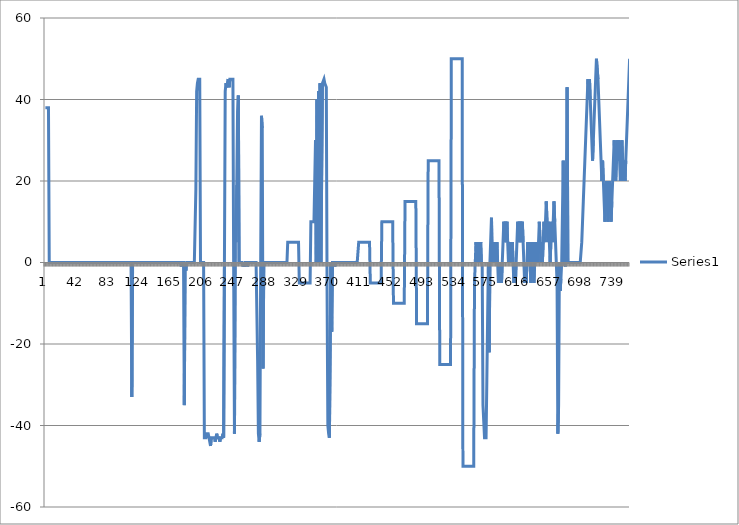
| Category | Series 0 |
|---|---|
| 0 | 38 |
| 1 | 38 |
| 2 | 38 |
| 3 | 38 |
| 4 | 38 |
| 5 | 0 |
| 6 | 0 |
| 7 | 0 |
| 8 | 0 |
| 9 | 0 |
| 10 | 0 |
| 11 | 0 |
| 12 | 0 |
| 13 | 0 |
| 14 | 0 |
| 15 | 0 |
| 16 | 0 |
| 17 | 0 |
| 18 | 0 |
| 19 | 0 |
| 20 | 0 |
| 21 | 0 |
| 22 | 0 |
| 23 | 0 |
| 24 | 0 |
| 25 | 0 |
| 26 | 0 |
| 27 | 0 |
| 28 | 0 |
| 29 | 0 |
| 30 | 0 |
| 31 | 0 |
| 32 | 0 |
| 33 | 0 |
| 34 | 0 |
| 35 | 0 |
| 36 | 0 |
| 37 | 0 |
| 38 | 0 |
| 39 | 0 |
| 40 | 0 |
| 41 | 0 |
| 42 | 0 |
| 43 | 0 |
| 44 | 0 |
| 45 | 0 |
| 46 | 0 |
| 47 | 0 |
| 48 | 0 |
| 49 | 0 |
| 50 | 0 |
| 51 | 0 |
| 52 | 0 |
| 53 | 0 |
| 54 | 0 |
| 55 | 0 |
| 56 | 0 |
| 57 | 0 |
| 58 | 0 |
| 59 | 0 |
| 60 | 0 |
| 61 | 0 |
| 62 | 0 |
| 63 | 0 |
| 64 | 0 |
| 65 | 0 |
| 66 | 0 |
| 67 | 0 |
| 68 | 0 |
| 69 | 0 |
| 70 | 0 |
| 71 | 0 |
| 72 | 0 |
| 73 | 0 |
| 74 | 0 |
| 75 | 0 |
| 76 | 0 |
| 77 | 0 |
| 78 | 0 |
| 79 | 0 |
| 80 | 0 |
| 81 | 0 |
| 82 | 0 |
| 83 | 0 |
| 84 | 0 |
| 85 | 0 |
| 86 | 0 |
| 87 | 0 |
| 88 | 0 |
| 89 | 0 |
| 90 | 0 |
| 91 | 0 |
| 92 | 0 |
| 93 | 0 |
| 94 | 0 |
| 95 | 0 |
| 96 | 0 |
| 97 | 0 |
| 98 | 0 |
| 99 | 0 |
| 100 | 0 |
| 101 | 0 |
| 102 | 0 |
| 103 | 0 |
| 104 | 0 |
| 105 | 0 |
| 106 | 0 |
| 107 | 0 |
| 108 | 0 |
| 109 | 0 |
| 110 | 0 |
| 111 | 0 |
| 112 | -33 |
| 113 | 0 |
| 114 | 0 |
| 115 | 0 |
| 116 | 0 |
| 117 | 0 |
| 118 | 0 |
| 119 | 0 |
| 120 | 0 |
| 121 | 0 |
| 122 | 0 |
| 123 | 0 |
| 124 | 0 |
| 125 | 0 |
| 126 | 0 |
| 127 | 0 |
| 128 | 0 |
| 129 | 0 |
| 130 | 0 |
| 131 | 0 |
| 132 | 0 |
| 133 | 0 |
| 134 | 0 |
| 135 | 0 |
| 136 | 0 |
| 137 | 0 |
| 138 | 0 |
| 139 | 0 |
| 140 | 0 |
| 141 | 0 |
| 142 | 0 |
| 143 | 0 |
| 144 | 0 |
| 145 | 0 |
| 146 | 0 |
| 147 | 0 |
| 148 | 0 |
| 149 | 0 |
| 150 | 0 |
| 151 | 0 |
| 152 | 0 |
| 153 | 0 |
| 154 | 0 |
| 155 | 0 |
| 156 | 0 |
| 157 | 0 |
| 158 | 0 |
| 159 | 0 |
| 160 | 0 |
| 161 | 0 |
| 162 | 0 |
| 163 | 0 |
| 164 | 0 |
| 165 | 0 |
| 166 | 0 |
| 167 | 0 |
| 168 | 0 |
| 169 | 0 |
| 170 | 0 |
| 171 | 0 |
| 172 | 0 |
| 173 | 0 |
| 174 | 0 |
| 175 | 0 |
| 176 | -1 |
| 177 | 0 |
| 178 | 0 |
| 179 | 0 |
| 180 | -35 |
| 181 | 0 |
| 182 | -2 |
| 183 | 0 |
| 184 | 0 |
| 185 | 0 |
| 186 | 0 |
| 187 | 0 |
| 188 | 0 |
| 189 | 0 |
| 190 | 0 |
| 191 | 0 |
| 192 | 0 |
| 193 | 0 |
| 194 | 0 |
| 195 | 18 |
| 196 | 42 |
| 197 | 44 |
| 198 | 45 |
| 199 | 45 |
| 200 | 45 |
| 201 | 0 |
| 202 | 0 |
| 203 | 0 |
| 204 | 0 |
| 205 | 0 |
| 206 | -43 |
| 207 | -43 |
| 208 | -43 |
| 209 | -42 |
| 210 | -42 |
| 211 | -42 |
| 212 | -43 |
| 213 | -43 |
| 214 | -45 |
| 215 | -43 |
| 216 | -43 |
| 217 | -43 |
| 218 | -43 |
| 219 | -43 |
| 220 | -44 |
| 221 | -43 |
| 222 | -42 |
| 223 | -43 |
| 224 | -43 |
| 225 | -43 |
| 226 | -44 |
| 227 | -43 |
| 228 | -43 |
| 229 | -43 |
| 230 | -42 |
| 231 | -43 |
| 232 | 0 |
| 233 | 42 |
| 234 | 44 |
| 235 | 43 |
| 236 | 43 |
| 237 | 45 |
| 238 | 43 |
| 239 | 45 |
| 240 | 45 |
| 241 | 45 |
| 242 | 45 |
| 243 | 45 |
| 244 | -3 |
| 245 | -42 |
| 246 | 6 |
| 247 | 5 |
| 248 | 19 |
| 249 | 37 |
| 250 | 41 |
| 251 | 0 |
| 252 | 0 |
| 253 | 0 |
| 254 | 0 |
| 255 | 0 |
| 256 | -1 |
| 257 | 0 |
| 258 | -1 |
| 259 | 0 |
| 260 | 0 |
| 261 | 0 |
| 262 | -1 |
| 263 | 0 |
| 264 | 0 |
| 265 | 0 |
| 266 | 0 |
| 267 | 0 |
| 268 | 0 |
| 269 | 0 |
| 270 | 0 |
| 271 | 0 |
| 272 | 0 |
| 273 | 0 |
| 274 | 0 |
| 275 | -24 |
| 276 | -42 |
| 277 | -44 |
| 278 | -42 |
| 279 | 1 |
| 280 | 36 |
| 281 | 33 |
| 282 | -26 |
| 283 | 0 |
| 284 | 0 |
| 285 | 0 |
| 286 | 0 |
| 287 | 0 |
| 288 | 0 |
| 289 | 0 |
| 290 | 0 |
| 291 | 0 |
| 292 | 0 |
| 293 | 0 |
| 294 | 0 |
| 295 | 0 |
| 296 | 0 |
| 297 | 0 |
| 298 | 0 |
| 299 | 0 |
| 300 | 0 |
| 301 | 0 |
| 302 | 0 |
| 303 | 0 |
| 304 | 0 |
| 305 | 0 |
| 306 | 0 |
| 307 | 0 |
| 308 | 0 |
| 309 | 0 |
| 310 | 0 |
| 311 | 0 |
| 312 | 0 |
| 313 | 0 |
| 314 | 5 |
| 315 | 5 |
| 316 | 5 |
| 317 | 5 |
| 318 | 5 |
| 319 | 5 |
| 320 | 5 |
| 321 | 5 |
| 322 | 5 |
| 323 | 5 |
| 324 | 5 |
| 325 | 5 |
| 326 | 5 |
| 327 | 5 |
| 328 | 5 |
| 329 | -5 |
| 330 | -5 |
| 331 | -5 |
| 332 | -5 |
| 333 | -5 |
| 334 | -5 |
| 335 | -5 |
| 336 | -5 |
| 337 | -5 |
| 338 | -5 |
| 339 | -5 |
| 340 | -5 |
| 341 | -5 |
| 342 | -5 |
| 343 | -5 |
| 344 | 10 |
| 345 | 10 |
| 346 | 10 |
| 347 | 10 |
| 348 | 10 |
| 349 | 10 |
| 350 | 30 |
| 351 | 0 |
| 352 | 40 |
| 353 | 0 |
| 354 | 42 |
| 355 | 0 |
| 356 | 44 |
| 357 | 0 |
| 358 | 0 |
| 359 | 44 |
| 360 | 44 |
| 361 | 45 |
| 362 | 44 |
| 363 | 44 |
| 364 | 43 |
| 365 | -7 |
| 366 | -40 |
| 367 | -42 |
| 368 | -43 |
| 369 | -43 |
| 370 | 0 |
| 371 | -17 |
| 372 | 0 |
| 373 | 0 |
| 374 | 0 |
| 375 | -1 |
| 376 | 0 |
| 377 | 0 |
| 378 | 0 |
| 379 | 0 |
| 380 | 0 |
| 381 | 0 |
| 382 | 0 |
| 383 | 0 |
| 384 | 0 |
| 385 | 0 |
| 386 | 0 |
| 387 | 0 |
| 388 | 0 |
| 389 | 0 |
| 390 | 0 |
| 391 | 0 |
| 392 | 0 |
| 393 | 0 |
| 394 | 0 |
| 395 | 0 |
| 396 | 0 |
| 397 | 0 |
| 398 | 0 |
| 399 | 0 |
| 400 | 0 |
| 401 | 0 |
| 402 | 0 |
| 403 | 0 |
| 404 | 0 |
| 405 | 0 |
| 406 | 5 |
| 407 | 5 |
| 408 | 5 |
| 409 | 5 |
| 410 | 5 |
| 411 | 5 |
| 412 | 5 |
| 413 | 5 |
| 414 | 5 |
| 415 | 5 |
| 416 | 5 |
| 417 | 5 |
| 418 | 5 |
| 419 | 5 |
| 420 | 5 |
| 421 | -5 |
| 422 | -5 |
| 423 | -5 |
| 424 | -5 |
| 425 | -5 |
| 426 | -5 |
| 427 | -5 |
| 428 | -5 |
| 429 | -5 |
| 430 | -5 |
| 431 | -5 |
| 432 | -5 |
| 433 | -5 |
| 434 | -5 |
| 435 | -5 |
| 436 | 10 |
| 437 | 10 |
| 438 | 10 |
| 439 | 10 |
| 440 | 10 |
| 441 | 10 |
| 442 | 10 |
| 443 | 10 |
| 444 | 10 |
| 445 | 10 |
| 446 | 10 |
| 447 | 10 |
| 448 | 10 |
| 449 | 10 |
| 450 | 10 |
| 451 | -10 |
| 452 | -10 |
| 453 | -10 |
| 454 | -10 |
| 455 | -10 |
| 456 | -10 |
| 457 | -10 |
| 458 | -10 |
| 459 | -10 |
| 460 | -10 |
| 461 | -10 |
| 462 | -10 |
| 463 | -10 |
| 464 | -10 |
| 465 | -10 |
| 466 | 15 |
| 467 | 15 |
| 468 | 15 |
| 469 | 15 |
| 470 | 15 |
| 471 | 15 |
| 472 | 15 |
| 473 | 15 |
| 474 | 15 |
| 475 | 15 |
| 476 | 15 |
| 477 | 15 |
| 478 | 15 |
| 479 | 15 |
| 480 | 15 |
| 481 | -15 |
| 482 | -15 |
| 483 | -15 |
| 484 | -15 |
| 485 | -15 |
| 486 | -15 |
| 487 | -15 |
| 488 | -15 |
| 489 | -15 |
| 490 | -15 |
| 491 | -15 |
| 492 | -15 |
| 493 | -15 |
| 494 | -15 |
| 495 | -15 |
| 496 | 25 |
| 497 | 25 |
| 498 | 25 |
| 499 | 25 |
| 500 | 25 |
| 501 | 25 |
| 502 | 25 |
| 503 | 25 |
| 504 | 25 |
| 505 | 25 |
| 506 | 25 |
| 507 | 25 |
| 508 | 25 |
| 509 | 25 |
| 510 | 25 |
| 511 | -25 |
| 512 | -25 |
| 513 | -25 |
| 514 | -25 |
| 515 | -25 |
| 516 | -25 |
| 517 | -25 |
| 518 | -25 |
| 519 | -25 |
| 520 | -25 |
| 521 | -25 |
| 522 | -25 |
| 523 | -25 |
| 524 | -25 |
| 525 | -25 |
| 526 | 50 |
| 527 | 50 |
| 528 | 50 |
| 529 | 50 |
| 530 | 50 |
| 531 | 50 |
| 532 | 50 |
| 533 | 50 |
| 534 | 50 |
| 535 | 50 |
| 536 | 50 |
| 537 | 50 |
| 538 | 50 |
| 539 | 50 |
| 540 | 50 |
| 541 | -50 |
| 542 | -50 |
| 543 | -50 |
| 544 | -50 |
| 545 | -50 |
| 546 | -50 |
| 547 | -50 |
| 548 | -50 |
| 549 | -50 |
| 550 | -50 |
| 551 | -50 |
| 552 | -50 |
| 553 | -50 |
| 554 | -50 |
| 555 | -50 |
| 556 | -5 |
| 557 | 0 |
| 558 | 5 |
| 559 | 0 |
| 560 | 5 |
| 561 | 0 |
| 562 | 5 |
| 563 | 0 |
| 564 | 5 |
| 565 | 0 |
| 566 | -1 |
| 567 | -35 |
| 568 | -39 |
| 569 | -43 |
| 570 | -43 |
| 571 | -43 |
| 572 | -29 |
| 573 | -14 |
| 574 | 0 |
| 575 | -22 |
| 576 | 0 |
| 577 | 0 |
| 578 | 11 |
| 579 | 0 |
| 580 | 0 |
| 581 | 5 |
| 582 | 0 |
| 583 | 5 |
| 584 | 0 |
| 585 | 5 |
| 586 | 0 |
| 587 | -5 |
| 588 | 0 |
| 589 | -5 |
| 590 | 0 |
| 591 | -5 |
| 592 | 0 |
| 593 | 5 |
| 594 | 10 |
| 595 | 5 |
| 596 | 10 |
| 597 | 5 |
| 598 | 10 |
| 599 | 5 |
| 600 | 0 |
| 601 | 5 |
| 602 | 0 |
| 603 | 5 |
| 604 | 0 |
| 605 | 5 |
| 606 | 0 |
| 607 | -5 |
| 608 | 0 |
| 609 | -5 |
| 610 | 0 |
| 611 | 5 |
| 612 | 10 |
| 613 | 5 |
| 614 | 10 |
| 615 | 5 |
| 616 | 10 |
| 617 | 5 |
| 618 | 10 |
| 619 | 5 |
| 620 | 0 |
| 621 | -5 |
| 622 | 0 |
| 623 | -5 |
| 624 | 0 |
| 625 | 5 |
| 626 | 0 |
| 627 | 5 |
| 628 | 0 |
| 629 | -5 |
| 630 | 0 |
| 631 | 5 |
| 632 | 0 |
| 633 | -5 |
| 634 | 0 |
| 635 | 5 |
| 636 | 0 |
| 637 | 5 |
| 638 | 0 |
| 639 | 5 |
| 640 | 10 |
| 641 | 5 |
| 642 | 0 |
| 643 | 5 |
| 644 | 0 |
| 645 | 5 |
| 646 | 10 |
| 647 | 5 |
| 648 | 10 |
| 649 | 15 |
| 650 | 10 |
| 651 | 5 |
| 652 | 10 |
| 653 | 5 |
| 654 | 0 |
| 655 | 5 |
| 656 | 10 |
| 657 | 5 |
| 658 | 10 |
| 659 | 15 |
| 660 | 10 |
| 661 | 5 |
| 662 | 0 |
| 663 | -5 |
| 664 | -42 |
| 665 | -35 |
| 666 | 0 |
| 667 | -7 |
| 668 | -4 |
| 669 | 0 |
| 670 | 0 |
| 671 | 25 |
| 672 | 0 |
| 673 | 0 |
| 674 | -1 |
| 675 | 17 |
| 676 | 43 |
| 677 | 0 |
| 678 | 0 |
| 679 | 0 |
| 680 | 0 |
| 681 | 0 |
| 682 | 0 |
| 683 | 0 |
| 684 | 0 |
| 685 | 0 |
| 686 | 0 |
| 687 | 0 |
| 688 | 0 |
| 689 | 0 |
| 690 | 0 |
| 691 | 0 |
| 692 | 0 |
| 693 | 0 |
| 694 | 0 |
| 695 | 5 |
| 696 | 10 |
| 697 | 15 |
| 698 | 20 |
| 699 | 25 |
| 700 | 30 |
| 701 | 35 |
| 702 | 40 |
| 703 | 45 |
| 704 | 40 |
| 705 | 45 |
| 706 | 40 |
| 707 | 35 |
| 708 | 30 |
| 709 | 25 |
| 710 | 30 |
| 711 | 35 |
| 712 | 40 |
| 713 | 45 |
| 714 | 50 |
| 715 | 50 |
| 716 | 45 |
| 717 | 40 |
| 718 | 35 |
| 719 | 30 |
| 720 | 25 |
| 721 | 20 |
| 722 | 25 |
| 723 | 20 |
| 724 | 15 |
| 725 | 10 |
| 726 | 15 |
| 727 | 20 |
| 728 | 15 |
| 729 | 10 |
| 730 | 15 |
| 731 | 20 |
| 732 | 15 |
| 733 | 10 |
| 734 | 15 |
| 735 | 20 |
| 736 | 25 |
| 737 | 30 |
| 738 | 25 |
| 739 | 20 |
| 740 | 25 |
| 741 | 30 |
| 742 | 25 |
| 743 | 30 |
| 744 | 25 |
| 745 | 20 |
| 746 | 25 |
| 747 | 30 |
| 748 | 25 |
| 749 | 20 |
| 750 | 25 |
| 751 | 20 |
| 752 | 25 |
| 753 | 30 |
| 754 | 35 |
| 755 | 40 |
| 756 | 45 |
| 757 | 50 |